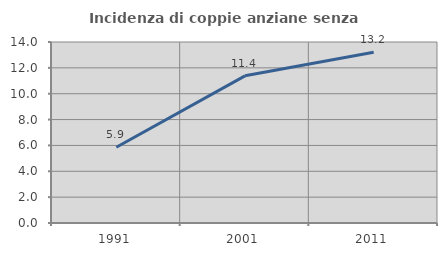
| Category | Incidenza di coppie anziane senza figli  |
|---|---|
| 1991.0 | 5.856 |
| 2001.0 | 11.382 |
| 2011.0 | 13.2 |